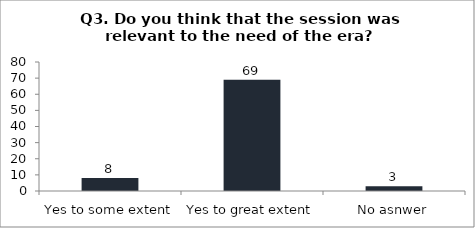
| Category | Q3. Do you think that the session was relevant to the need of the era? |
|---|---|
| Yes to some extent | 8 |
| Yes to great extent | 69 |
| No asnwer | 3 |